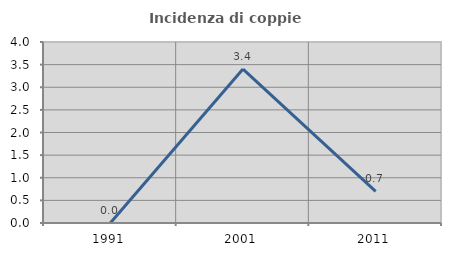
| Category | Incidenza di coppie miste |
|---|---|
| 1991.0 | 0 |
| 2001.0 | 3.401 |
| 2011.0 | 0.699 |